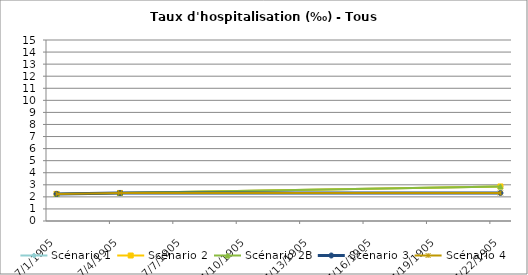
| Category | Scénario 1 | Scénario 2 | Scénario 2B | Scénario 3 | Scénario 4 |
|---|---|---|---|---|---|
| 2009.0 | 2.244 | 2.244 | 2.244 | 2.244 | 2.244 |
| 2012.0 | 2.323 | 2.323 | 2.323 | 2.323 | 2.323 |
| 2030.0 | 2.859 | 2.862 | 2.859 | 2.323 | 2.323 |